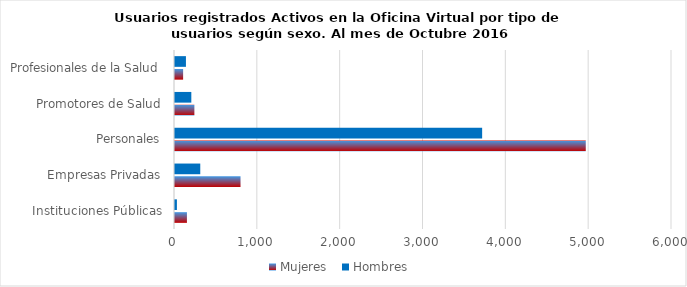
| Category | Mujeres | Hombres |
|---|---|---|
| Instituciones Públicas | 144 | 23 |
| Empresas Privadas | 791 | 305 |
| Personales | 4959 | 3708 |
| Promotores de Salud | 234 | 197 |
| Profesionales de la Salud | 98 | 132 |